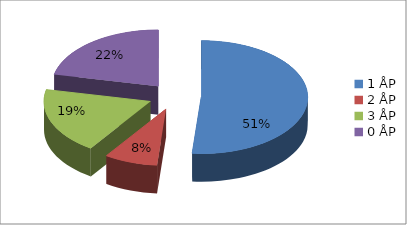
| Category | Antall premieringer på ÅP sesongen 12/13 |
|---|---|
| 1 ÅP | 19 |
| 2 ÅP | 3 |
| 3 ÅP | 7 |
| 0 ÅP | 8 |